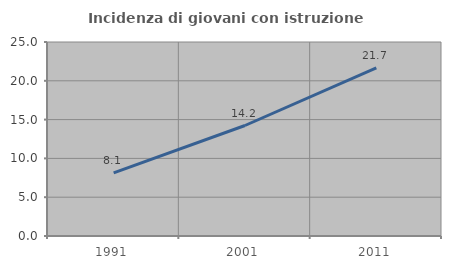
| Category | Incidenza di giovani con istruzione universitaria |
|---|---|
| 1991.0 | 8.127 |
| 2001.0 | 14.239 |
| 2011.0 | 21.681 |